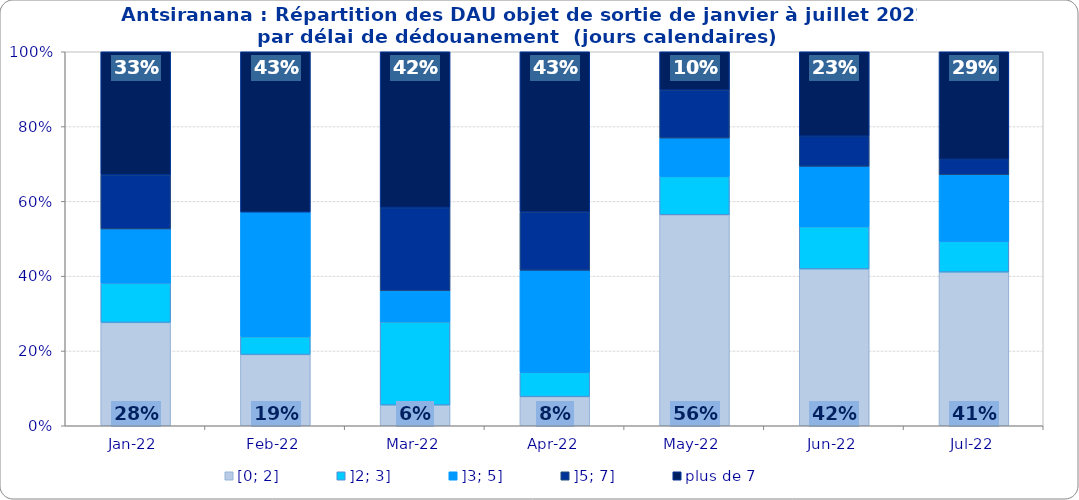
| Category | [0; 2] | ]2; 3] | ]3; 5] | ]5; 7] | plus de 7 |
|---|---|---|---|---|---|
| 2022-01-01 | 0.276 | 0.105 | 0.145 | 0.145 | 0.329 |
| 2022-02-01 | 0.19 | 0.048 | 0.333 | 0 | 0.429 |
| 2022-03-01 | 0.056 | 0.222 | 0.083 | 0.222 | 0.417 |
| 2022-04-01 | 0.078 | 0.065 | 0.273 | 0.156 | 0.429 |
| 2022-05-01 | 0.564 | 0.103 | 0.103 | 0.128 | 0.103 |
| 2022-06-01 | 0.419 | 0.113 | 0.161 | 0.081 | 0.226 |
| 2022-07-01 | 0.411 | 0.082 | 0.178 | 0.041 | 0.288 |